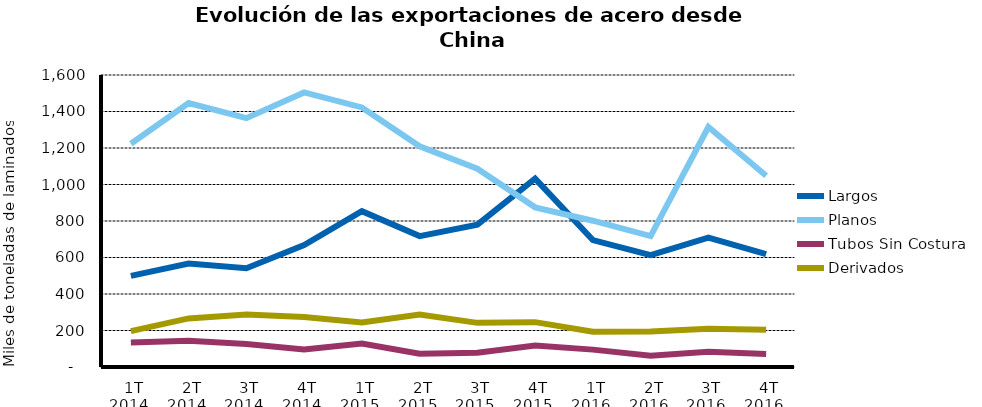
| Category | Largos | Planos | Tubos Sin Costura | Derivados |
|---|---|---|---|---|
| 1T 2014 | 499.636 | 1223.462 | 134.065 | 196.554 |
| 2T 2014 | 567.003 | 1446.297 | 143.936 | 266.276 |
| 3T 2014 | 541.448 | 1363.46 | 125.512 | 287.557 |
| 4T 2014 | 668.382 | 1504.56 | 96.23 | 274.347 |
| 1T 2015 | 853.638 | 1422.338 | 128.017 | 244.212 |
| 2T 2015 | 717.151 | 1209.024 | 72.26 | 288.116 |
| 3T 2015 | 780.23 | 1086.386 | 77.981 | 241.859 |
| 4T 2015 | 1032.176 | 874.821 | 117.343 | 245.677 |
| 1T 2016 | 695.227 | 801.509 | 95.238 | 192.732 |
| 2T 2016 | 612.386 | 717.291 | 61.792 | 194.275 |
| 3T 2016 | 709.489 | 1314.814 | 83.654 | 210.013 |
| 4T 2016 | 618.044 | 1048.139 | 70.687 | 204.579 |